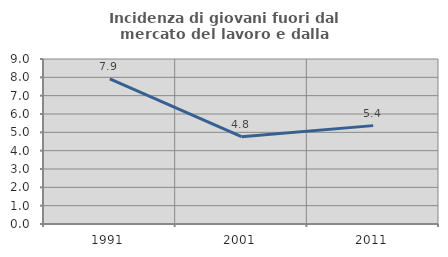
| Category | Incidenza di giovani fuori dal mercato del lavoro e dalla formazione  |
|---|---|
| 1991.0 | 7.917 |
| 2001.0 | 4.762 |
| 2011.0 | 5.366 |